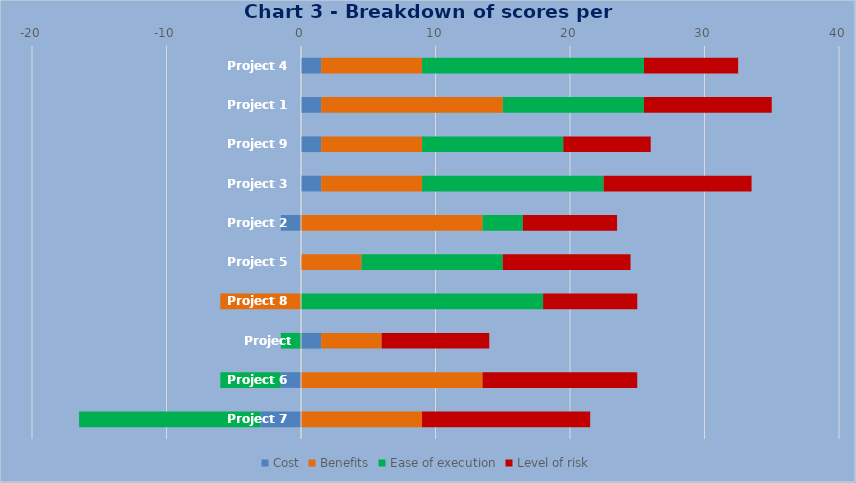
| Category | Cost | Benefits | Ease of execution | Level of risk |
|---|---|---|---|---|
| Project 4 | 1.5 | 7.5 | 16.5 | 7 |
| Project 1 | 1.5 | 13.5 | 10.5 | 9.5 |
| Project 9 | 1.5 | 7.5 | 10.5 | 6.5 |
| Project 3 | 1.5 | 7.5 | 13.5 | 11 |
| Project 2 | -1.5 | 13.5 | 3 | 7 |
| Project 5 | 0 | 4.5 | 10.5 | 9.5 |
| Project 8 | 0 | -6 | 18 | 7 |
| Project 10 | 1.5 | 4.5 | -1.5 | 8 |
| Project 6 | -1.5 | 13.5 | -4.5 | 11.5 |
| Project 7 | -3 | 9 | -13.5 | 12.5 |